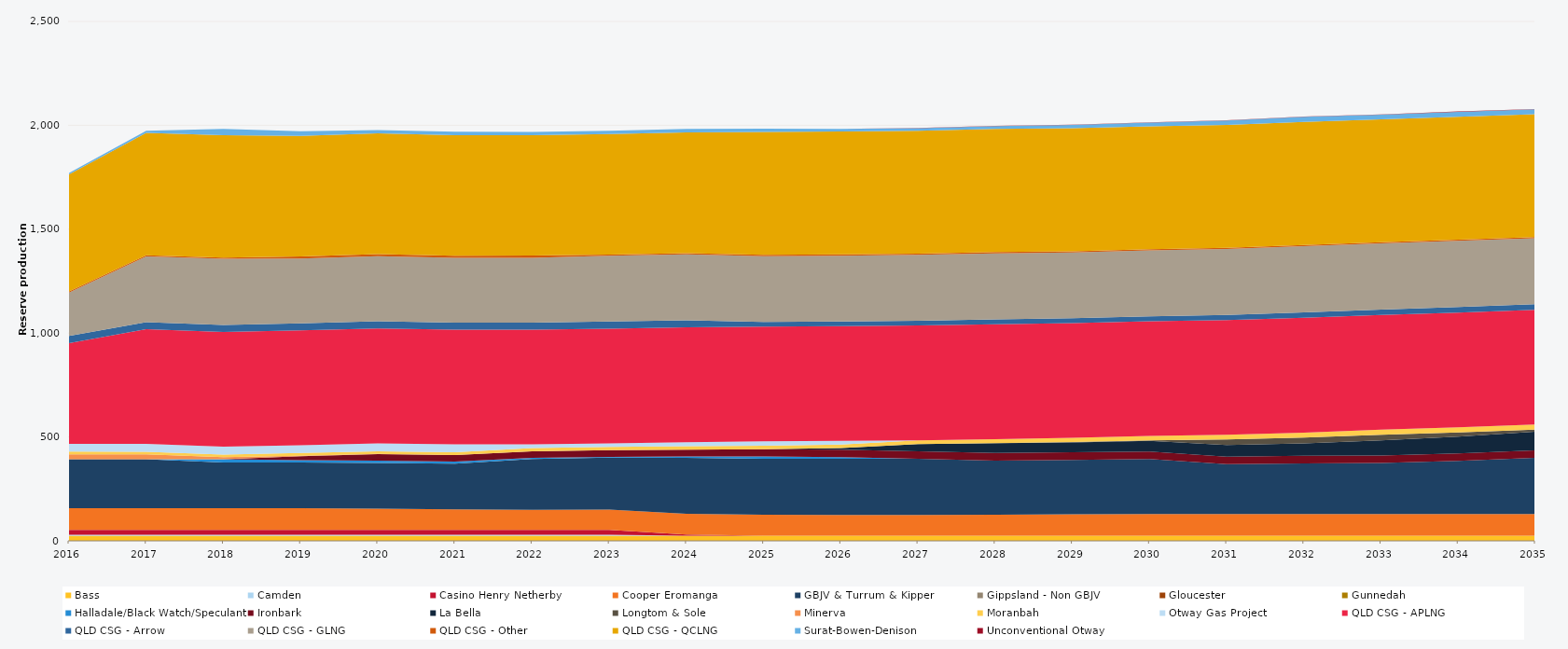
| Category | Bass | Camden | Casino Henry Netherby | Cooper Eromanga | GBJV & Turrum & Kipper | Gippsland - Non GBJV | Gloucester | Gunnedah | Halladale/Black Watch/Speculant | Ironbark | La Bella | Longtom & Sole | Minerva | Moranbah | Otway Gas Project | QLD CSG - APLNG | QLD CSG - Arrow | QLD CSG - GLNG | QLD CSG - Other | QLD CSG - QCLNG | Surat-Bowen-Denison | Unconventional Otway |
|---|---|---|---|---|---|---|---|---|---|---|---|---|---|---|---|---|---|---|---|---|---|---|
| 2016 | 24.522 | 5 | 23.12 | 105 | 235.041 | 0 | 0 | 0 | 0 | 0 | 0 | 0 | 23.79 | 12.867 | 38 | 484.599 | 34.038 | 208.948 | 5.856 | 563.525 | 5.979 | 0 |
| 2017 | 24.455 | 5 | 23.12 | 105 | 234.628 | 0 | 0 | 0 | 0 | 0 | 0 | 0 | 23.725 | 12.873 | 38 | 552.245 | 33.945 | 315.713 | 5.84 | 589.464 | 9.604 | 0 |
| 2018 | 24.455 | 5 | 23.12 | 105 | 220 | 0 | 0 | 0 | 15.424 | 0 | 0 | 0 | 9.373 | 13.04 | 38 | 552.245 | 33.945 | 317.886 | 5.84 | 588.841 | 30 | 0 |
| 2019 | 24.455 | 5 | 23.12 | 105 | 220 | 0 | 0 | 0 | 10.95 | 18.25 | 0 | 0 | 3.025 | 12.81 | 38 | 552.245 | 33.945 | 312.03 | 10.403 | 579.675 | 22.318 | 0 |
| 2020 | 24.522 | 5 | 23.12 | 102.21 | 220 | 0 | 0 | 0 | 10.95 | 31.573 | 0 | 0 | 0.837 | 12.781 | 38 | 553.758 | 34.038 | 312.817 | 10.419 | 581.403 | 15.232 | 0 |
| 2021 | 24.455 | 5 | 23.12 | 98.743 | 220 | 0 | 0 | 0 | 9.94 | 31.496 | 0 | 0 | 0 | 13.533 | 38 | 552.245 | 33.945 | 311.959 | 10.403 | 580.101 | 16.54 | 0 |
| 2022 | 24.455 | 5 | 23.12 | 97.216 | 244.607 | 0 | 0 | 0 | 4.849 | 32.138 | 0 | 0 | 0 | 15.298 | 17.796 | 552.245 | 33.945 | 311.898 | 10.403 | 579.606 | 15.502 | 0 |
| 2023 | 24.455 | 5 | 23.12 | 98.292 | 249.161 | 0 | 0 | 0 | 4.185 | 32.092 | 0 | 0 | 0 | 16.264 | 16.685 | 552.245 | 33.945 | 316.625 | 5.84 | 579.587 | 16.036 | 0 |
| 2024 | 24.522 | 0 | 5.3 | 100.02 | 270 | 0 | 0 | 0 | 6.767 | 31.833 | 0 | 0 | 0 | 16.79 | 18.867 | 553.758 | 34.038 | 317.359 | 5.856 | 580.592 | 16.464 | 0 |
| 2025 | 24.455 | 0 | 0 | 101.039 | 270 | 0 | 0 | 0 | 10.95 | 34.554 | 0 | 0 | 0 | 17.268 | 21.073 | 552.245 | 22.035 | 316.795 | 5.84 | 591.794 | 15.243 | 0 |
| 2026 | 24.455 | 0 | 0 | 100.577 | 270 | 0 | 0 | 0 | 7.985 | 35.404 | 7.64 | 0.185 | 0 | 17.518 | 17.185 | 552.245 | 22.841 | 316.693 | 5.84 | 591.753 | 12.395 | 0.205 |
| 2027 | 24.455 | 0 | 0 | 100.606 | 270 | 0 | 0 | 0 | 0 | 36.016 | 34.66 | 0.225 | 0 | 18.14 | 0 | 552.245 | 23.131 | 316.854 | 5.84 | 591.693 | 12.418 | 0.929 |
| 2028 | 24.522 | 0 | 0 | 100.844 | 260.611 | 0 | 0 | 0 | 0 | 36.6 | 47.244 | 0.21 | 0 | 18.99 | 0 | 553.758 | 23.47 | 317.828 | 5.856 | 593.234 | 13.255 | 0.755 |
| 2029 | 24.455 | 0 | 0 | 103.011 | 262.304 | 0 | 0 | 0 | 0 | 36.5 | 47.666 | 1.542 | 0 | 20.344 | 0 | 552.245 | 23.353 | 316.897 | 5.84 | 591.622 | 15.776 | 1.063 |
| 2030 | 24.455 | 0 | 0 | 105 | 264.048 | 0 | 0 | 0 | 0 | 36.5 | 51.57 | 1.592 | 0 | 21.608 | 0 | 552.245 | 23.602 | 317.279 | 5.84 | 591.579 | 17.949 | 0.71 |
| 2031 | 24.455 | 0 | 0 | 105 | 239.416 | 0 | 0 | 0 | 0 | 36.5 | 55.31 | 27.375 | 0 | 22.555 | 0 | 552.245 | 24.176 | 317.559 | 5.84 | 591.53 | 20.6 | 1.224 |
| 2032 | 24.522 | 0 | 0 | 105 | 242.918 | 0 | 0 | 0 | 0 | 36.6 | 60.276 | 27.45 | 0 | 23.473 | 0 | 553.758 | 25.27 | 318.687 | 5.856 | 593.07 | 23.715 | 2.019 |
| 2033 | 24.455 | 0 | 0 | 105 | 245.205 | 0 | 0 | 0 | 0 | 36.5 | 72.339 | 27.375 | 0 | 23.984 | 0 | 552.245 | 26.292 | 318.155 | 5.84 | 591.435 | 22.674 | 1.027 |
| 2034 | 24.455 | 0 | 0 | 105 | 255.21 | 0 | 0 | 0 | 0 | 36.5 | 79.989 | 20.902 | 0 | 24.559 | 0 | 552.245 | 26.478 | 318.338 | 5.84 | 591.394 | 23.82 | 1.784 |
| 2035 | 24.455 | 0 | 0 | 105 | 269.884 | 0 | 0 | 0 | 0 | 36.5 | 89.275 | 10.065 | 0 | 24.812 | 0 | 552.245 | 26.393 | 317.822 | 5.84 | 591.053 | 23.995 | 1.284 |